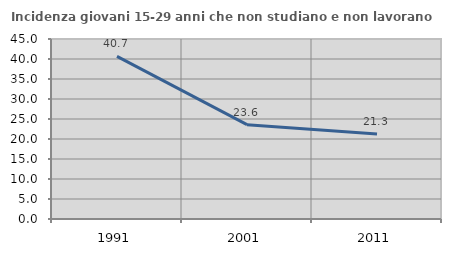
| Category | Incidenza giovani 15-29 anni che non studiano e non lavorano  |
|---|---|
| 1991.0 | 40.668 |
| 2001.0 | 23.592 |
| 2011.0 | 21.267 |